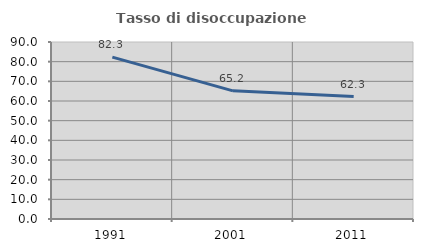
| Category | Tasso di disoccupazione giovanile  |
|---|---|
| 1991.0 | 82.309 |
| 2001.0 | 65.154 |
| 2011.0 | 62.287 |